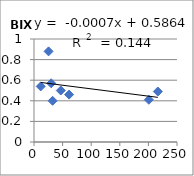
| Category | BIX |
|---|---|
| 25.5 | 0.88 |
| 61.3 | 0.46 |
| 11.7 | 0.54 |
| 216.5 | 0.49 |
| 46.8 | 0.5 |
| 32.5 | 0.4 |
| 200.8 | 0.41 |
| 30.1 | 0.57 |